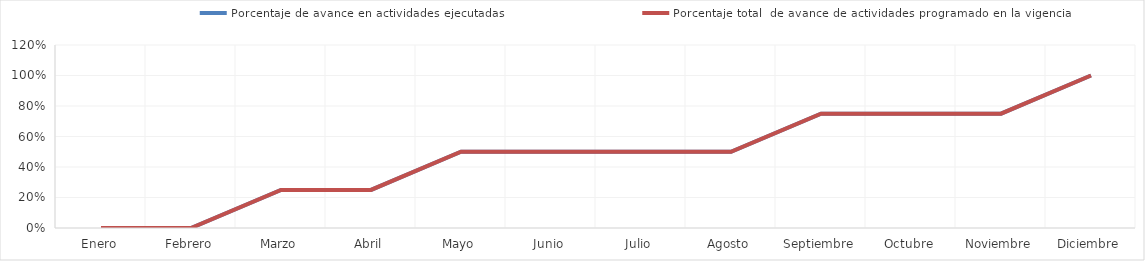
| Category | Porcentaje de avance en actividades ejecutadas | Porcentaje total  de avance de actividades programado en la vigencia |
|---|---|---|
| 0 | 0 | 0 |
| 1 | 0 | 0 |
| 2 | 0.25 | 0.25 |
| 3 | 0.25 | 0.25 |
| 4 | 0.5 | 0.5 |
| 5 | 0.5 | 0.5 |
| 6 | 0.5 | 0.5 |
| 7 | 0.5 | 0.5 |
| 8 | 0.75 | 0.75 |
| 9 | 0.75 | 0.75 |
| 10 | 0.75 | 0.75 |
| 11 | 1 | 1 |